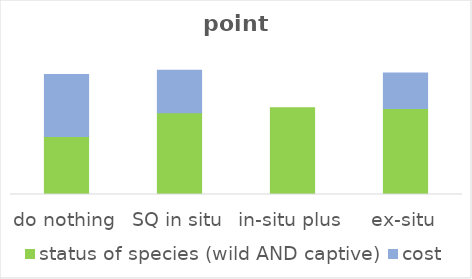
| Category | status of species (wild AND captive) | cost |
|---|---|---|
| do nothing | 0.311 | 0.333 |
| SQ in situ | 0.439 | 0.228 |
| in-situ plus | 0.466 | 0 |
| ex-situ | 0.461 | 0.191 |